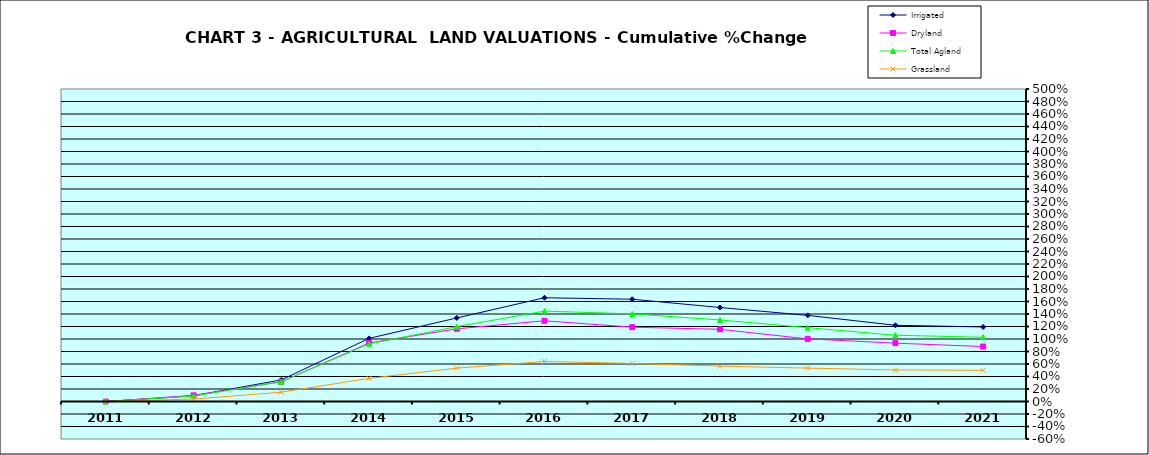
| Category | Irrigated | Dryland | Total Agland | Grassland |
|---|---|---|---|---|
| 2011.0 | 0 | 0 | 0 | 0 |
| 2012.0 | 0.092 | 0.098 | 0.088 | 0.039 |
| 2013.0 | 0.346 | 0.316 | 0.316 | 0.149 |
| 2014.0 | 1.01 | 0.935 | 0.923 | 0.37 |
| 2015.0 | 1.337 | 1.163 | 1.198 | 0.534 |
| 2016.0 | 1.66 | 1.292 | 1.447 | 0.64 |
| 2017.0 | 1.636 | 1.189 | 1.402 | 0.609 |
| 2018.0 | 1.504 | 1.155 | 1.305 | 0.567 |
| 2019.0 | 1.378 | 1.002 | 1.181 | 0.534 |
| 2020.0 | 1.219 | 0.933 | 1.06 | 0.505 |
| 2021.0 | 1.193 | 0.88 | 1.028 | 0.499 |